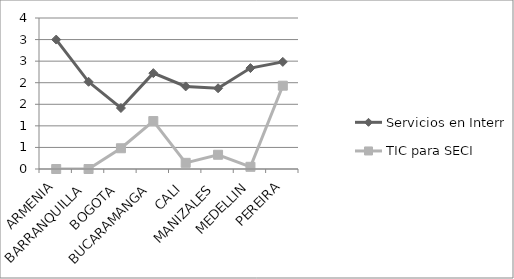
| Category | Servicios en Internet | TIC para SECI |
|---|---|---|
| ARMENIA | 3 | 0 |
| BARRANQUILLA | 2.021 | 0 |
| BOGOTA | 1.413 | 0.481 |
| BUCARAMANGA | 2.222 | 1.111 |
| CALI | 1.914 | 0.143 |
| MANIZALES | 1.872 | 0.33 |
| MEDELLIN | 2.339 | 0.051 |
| PEREIRA | 2.483 | 1.931 |